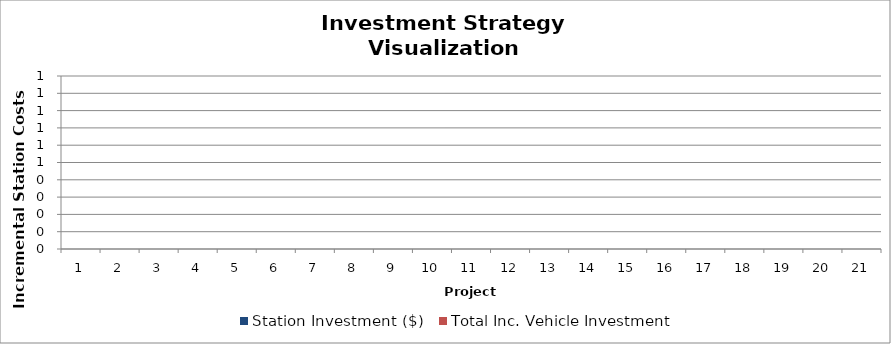
| Category | Station Investment ($) | Total Inc. Vehicle Investment |
|---|---|---|
| 0 | 0 | 0 |
| 1 | 0 | 0 |
| 2 | 0 | 0 |
| 3 | 0 | 0 |
| 4 | 0 | 0 |
| 5 | 0 | 0 |
| 6 | 0 | 0 |
| 7 | 0 | 0 |
| 8 | 0 | 0 |
| 9 | 0 | 0 |
| 10 | 0 | 0 |
| 11 | 0 | 0 |
| 12 | 0 | 0 |
| 13 | 0 | 0 |
| 14 | 0 | 0 |
| 15 | 0 | 0 |
| 16 | 0 | 0 |
| 17 | 0 | 0 |
| 18 | 0 | 0 |
| 19 | 0 | 0 |
| 20 | 0 | 0 |